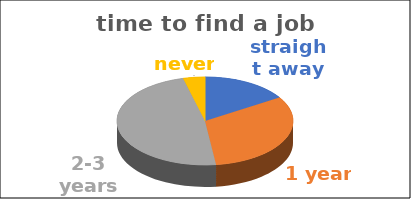
| Category | time to find a job |
|---|---|
| straight away | 0.16 |
| 1 year | 0.32 |
| 2-3 years | 0.48 |
| never | 0.04 |